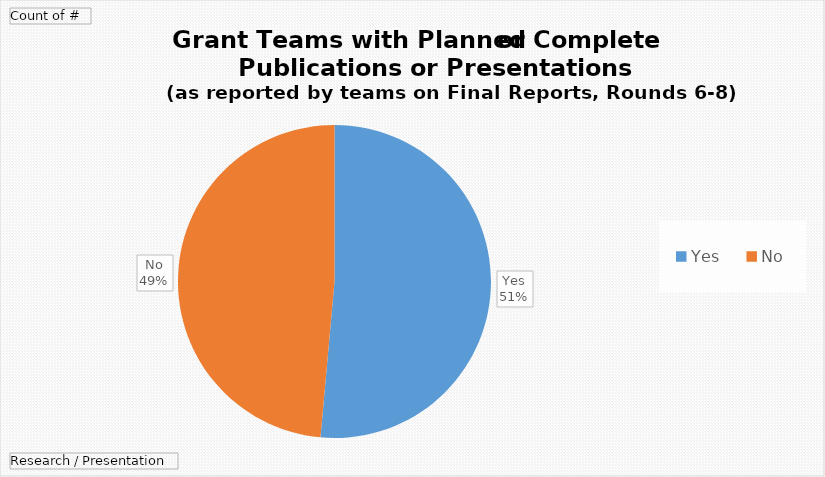
| Category | Total |
|---|---|
| Yes | 18 |
| No | 17 |